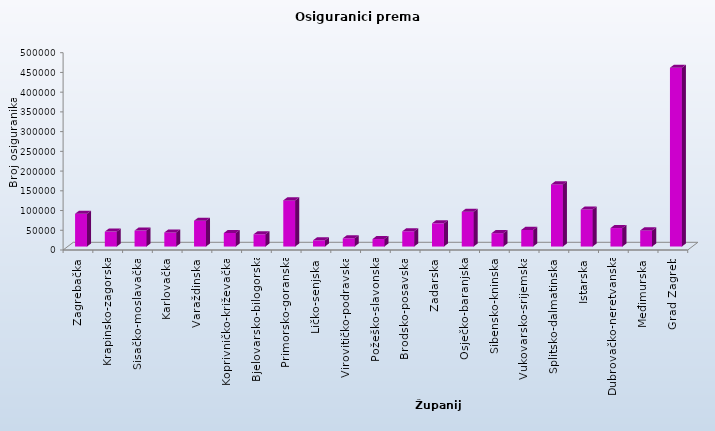
| Category | Series 0 |
|---|---|
| Zagrebačka | 83131 |
| Krapinsko-zagorska | 37850 |
| Sisačko-moslavačka | 40463 |
| Karlovačka | 35617 |
| Varaždinska | 65412 |
| Koprivničko-križevačka | 34263 |
| Bjelovarsko-bilogorska | 31015 |
| Primorsko-goranska | 116970 |
| Ličko-senjska | 15770 |
| Virovitičko-podravska | 20879 |
| Požeško-slavonska | 19011 |
| Brodsko-posavska | 38638 |
| Zadarska | 58818 |
| Osječko-baranjska | 88197 |
| Šibensko-kninska | 33803 |
| Vukovarsko-srijemska | 42048 |
| Splitsko-dalmatinska | 157340 |
| Istarska | 93843 |
| Dubrovačko-neretvanska | 46822 |
| Međimurska | 40811 |
| Grad Zagreb | 453178 |